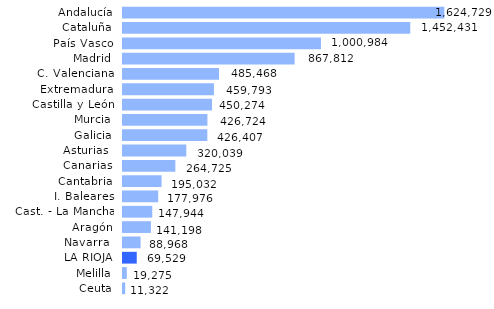
| Category | Series 0 |
|---|---|
| Ceuta | 11322.37 |
| Melilla | 19274.67 |
| LA RIOJA | 69529.019 |
| Navarra  | 88968.105 |
| Aragón | 141197.565 |
| Cast. - La Mancha | 147944.016 |
| I. Baleares | 177976.159 |
| Cantabria | 195032.064 |
| Canarias | 264725.468 |
| Asturias  | 320038.684 |
| Galicia | 426407.227 |
| Murcia | 426723.593 |
| Castilla y León | 450273.663 |
| Extremadura | 459792.574 |
| C. Valenciana | 485467.632 |
| Madrid | 867812.441 |
| País Vasco | 1000983.828 |
| Cataluña | 1452430.971 |
| Andalucía | 1624729.364 |